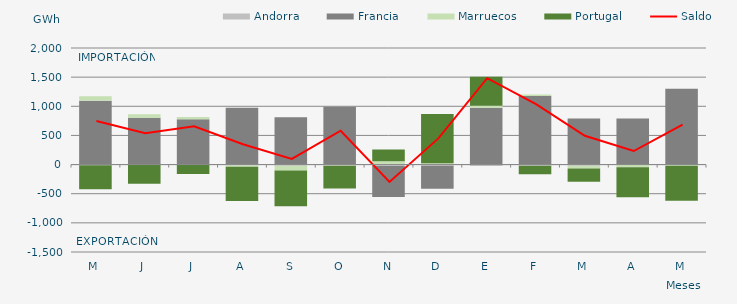
| Category | Andorra | Francia | Marruecos | Portugal |
|---|---|---|---|---|
| M | -12.717 | 1093.205 | 77.107 | -409.795 |
| J | -8.299 | 804.225 | 59.96 | -319.011 |
| J | -1.488 | 777.149 | 40.929 | -159.488 |
| A | -16.745 | 974.066 | -21.389 | -587.13 |
| S | -21.816 | 812.203 | -79.308 | -613.114 |
| O | -14.818 | 993.522 | -4.279 | -393.484 |
| N | -22.557 | -531.947 | 57.949 | 199.161 |
| D | -20.764 | -396.046 | 21.949 | 843.669 |
| E | -24.438 | 973.605 | 35.757 | 497.454 |
| F | -19.197 | 1176.23 | 25.948 | -147.199 |
| M | -22.309 | 789.686 | -47.202 | -226.399 |
| A | -6.988 | 791.615 | -38.41 | -513.779 |
| M | -1.245 | 1302.344 | -18.608 | -598.82 |